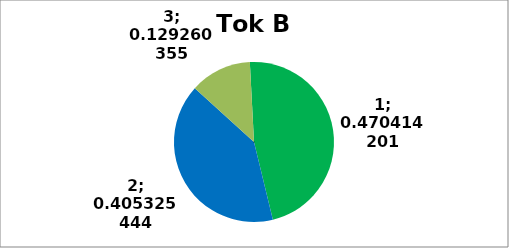
| Category | Series 0 |
|---|---|
| 0 | 159 |
| 1 | 137 |
| 2 | 42 |